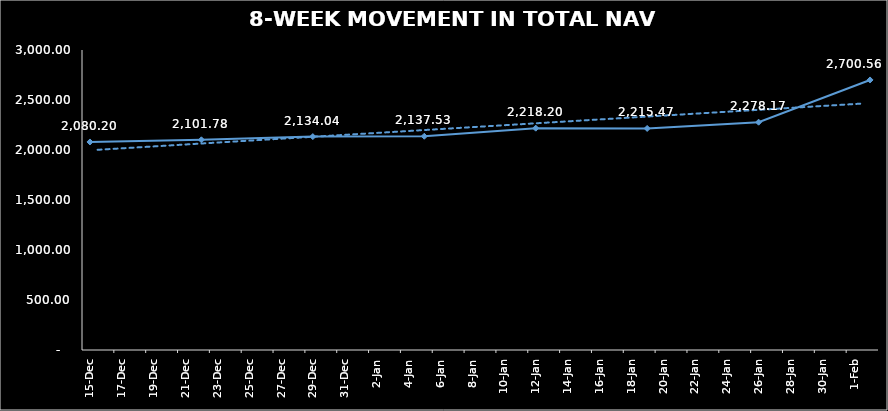
| Category | TOTAL NAV |
|---|---|
| 2023-12-15 | 2080.204 |
| 2023-12-22 | 2101.782 |
| 2023-12-29 | 2134.045 |
| 2024-01-05 | 2137.525 |
| 2024-01-12 | 2218.205 |
| 2024-01-19 | 2215.471 |
| 2024-01-26 | 2278.172 |
| 2024-02-02 | 2700.559 |